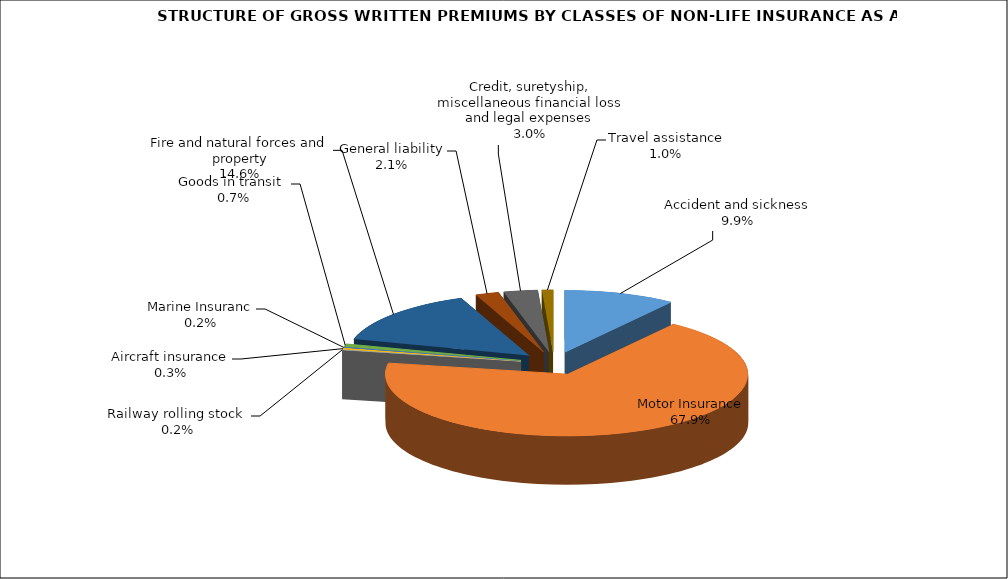
| Category | Accident and sickness | Series 1 |
|---|---|---|
| Accident and sickness | 0.099 |  |
| Motor Insurance | 0.679 |  |
| Railway rolling stock  | 0.002 |  |
| Aircraft insurance | 0.003 |  |
| Marine Insuranc | 0.002 |  |
| Goods in transit  | 0.007 |  |
| Fire and natural forces and property | 0.146 |  |
| General liability | 0.021 |  |
| Credit, suretyship, miscellaneous financial loss and legal expenses | 0.03 |  |
| Travel assistance | 0.01 |  |